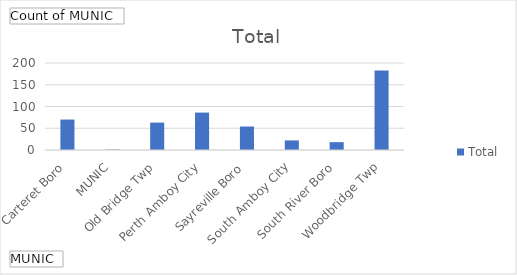
| Category | Total |
|---|---|
| Carteret Boro | 70 |
| MUNIC | 1 |
| Old Bridge Twp | 63 |
| Perth Amboy City | 86 |
| Sayreville Boro | 54 |
| South Amboy City | 22 |
| South River Boro | 18 |
| Woodbridge Twp | 183 |